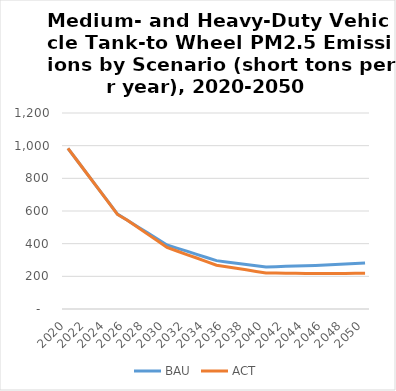
| Category | BAU | ACT |
|---|---|---|
| 2020.0 | 984 | 984 |
| 2021.0 | 903 | 903 |
| 2022.0 | 823 | 822 |
| 2023.0 | 742 | 741 |
| 2024.0 | 662 | 660 |
| 2025.0 | 581 | 579 |
| 2026.0 | 543 | 543 |
| 2027.0 | 505 | 502 |
| 2028.0 | 468 | 460 |
| 2029.0 | 430 | 419 |
| 2030.0 | 392 | 377 |
| 2031.0 | 373 | 355 |
| 2032.0 | 354 | 333 |
| 2033.0 | 334 | 312 |
| 2034.0 | 315 | 290 |
| 2035.0 | 296 | 268 |
| 2036.0 | 288 | 259 |
| 2037.0 | 280 | 249 |
| 2038.0 | 273 | 240 |
| 2039.0 | 265 | 230 |
| 2040.0 | 257 | 221 |
| 2041.0 | 259 | 220 |
| 2042.0 | 261 | 219 |
| 2043.0 | 263 | 219 |
| 2044.0 | 265 | 218 |
| 2045.0 | 267 | 217 |
| 2046.0 | 270 | 217 |
| 2047.0 | 273 | 218 |
| 2048.0 | 275 | 218 |
| 2049.0 | 278 | 219 |
| 2050.0 | 281 | 219 |